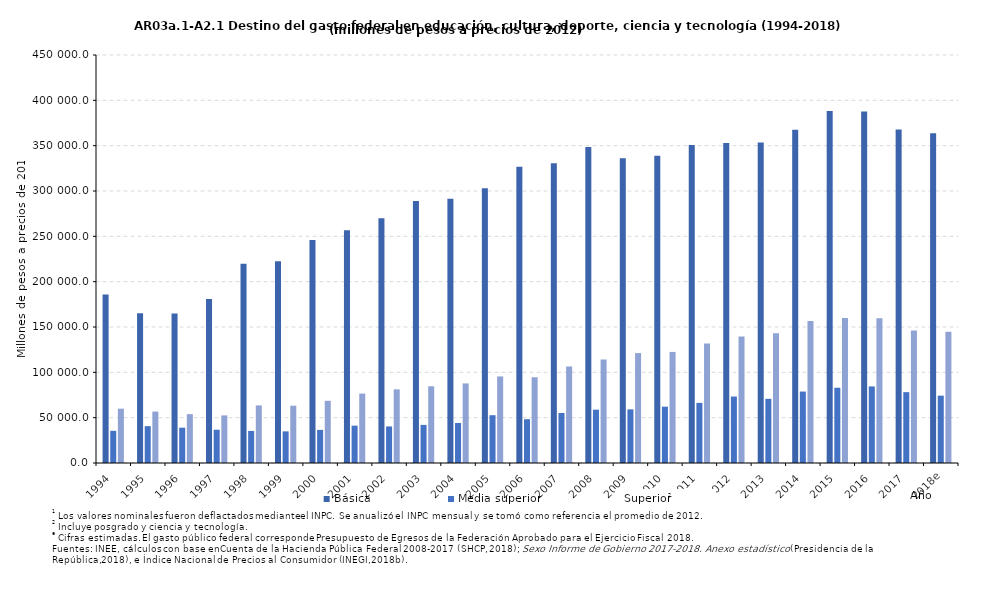
| Category | Básica | Media superior | Superior2 |
|---|---|---|---|
| 1994 | 185827.371 | 35491.503 | 59916.07 |
| 1995 | 165072.696 | 40640.941 | 56704.059 |
| 1996 | 164901.507 | 38961.891 | 53889.304 |
| 1997 | 180785.925 | 36703.992 | 52513.072 |
| 1998 | 219828.274 | 35359.44 | 63484.196 |
| 1999 | 222524.255 | 34894.175 | 63180.167 |
| 2000 | 246083.63 | 36515.877 | 68593.836 |
| 2001 | 256729.951 | 41169.293 | 76529.515 |
| 2002 | 269839.393 | 40315.6 | 81211.604 |
| 2003 | 289103.736 | 42023.57 | 84606.221 |
| 2004 | 291333.637 | 44122.294 | 87773.503 |
| 2005 | 303010.577 | 52722.546 | 95473.601 |
| 2006 | 326805.54 | 48307.059 | 94551.905 |
| 2007 | 330618.259 | 55157.165 | 106463.743 |
| 2008 | 348646.461 | 58803.08 | 114154.019 |
| 2009 | 336033.255 | 59143.466 | 121228.099 |
| 2010 | 338834.171 | 62087.956 | 122504.146 |
| 2011 | 350688.685 | 66298.105 | 131815.373 |
| 2012 | 352975.021 | 73318.725 | 139507.9 |
| 2013 | 353398.662 | 70797.886 | 143007.762 |
| 2014 | 367644.181 | 78784.827 | 156684.255 |
| 2015 | 388268.728 | 82994.177 | 159959.652 |
| 2016 | 387665.328 | 84470.389 | 159742.667 |
| 2017 | 367966.017 | 78144.467 | 146204.826 |
| 2018e | 363672.659 | 74289.672 | 144812.533 |